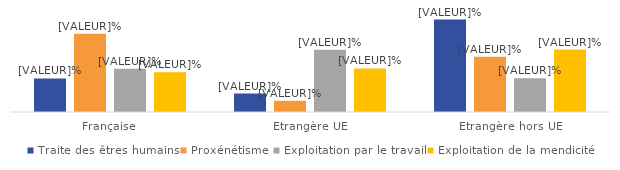
| Category | Traite des êtres humains | Proxénétisme | Exploitation par le travail | Exploitation de la mendicité |
|---|---|---|---|---|
| Française | 22.995 | 53.774 | 29.67 | 27.273 |
| Etrangère UE | 12.684 | 7.688 | 42.654 | 29.87 |
| Etrangère hors UE | 63.421 | 37.882 | 23.235 | 42.857 |